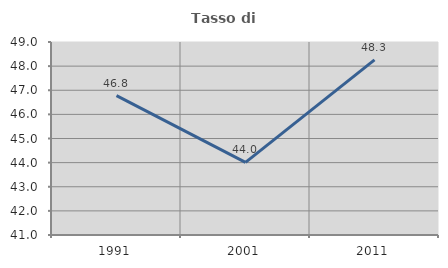
| Category | Tasso di occupazione   |
|---|---|
| 1991.0 | 46.777 |
| 2001.0 | 44.012 |
| 2011.0 | 48.257 |